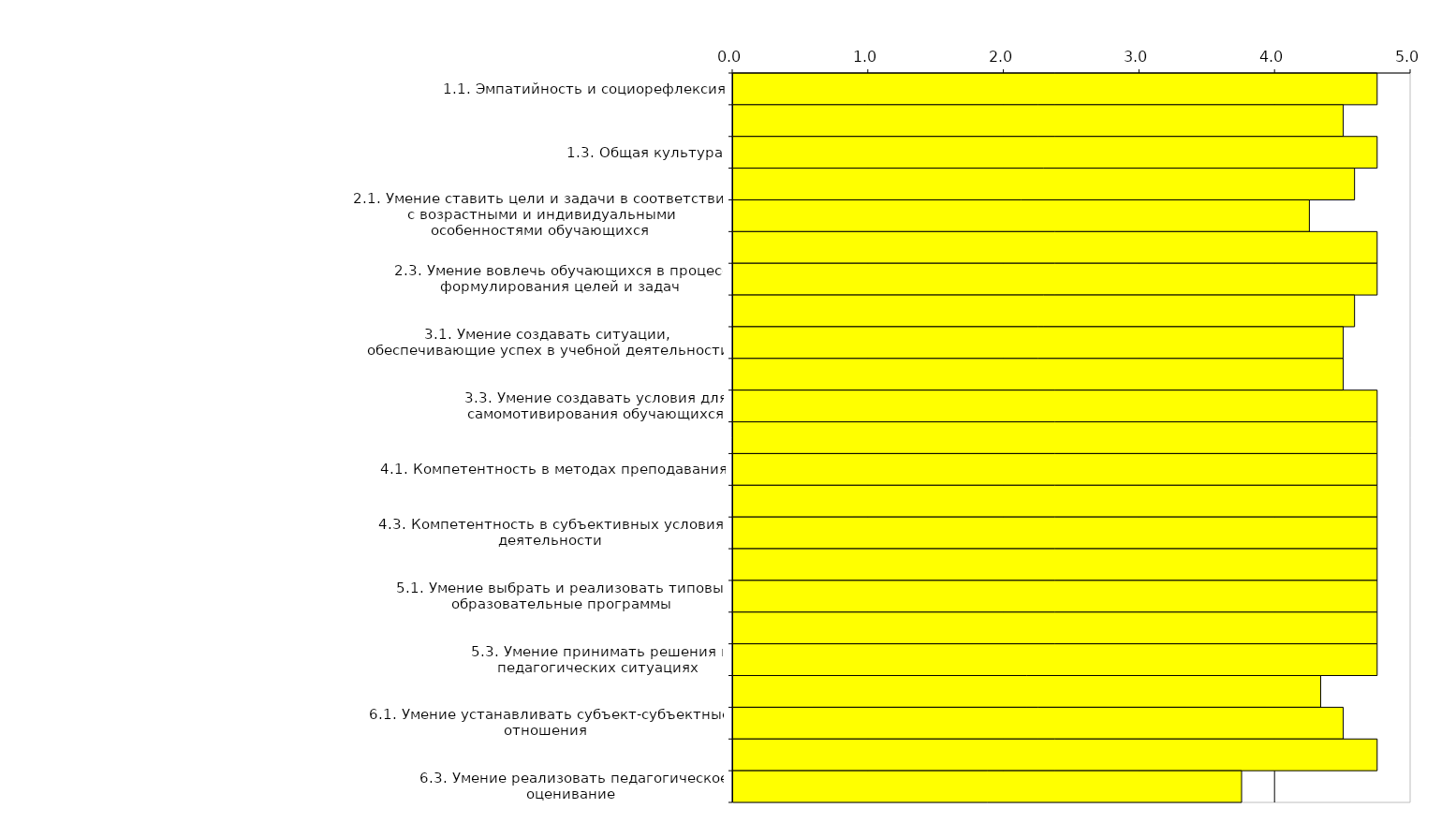
| Category | Series 0 |
|---|---|
| 1.1. Эмпатийность и социорефлексия | 4.75 |
| 1.2. Самоорганизованность | 4.5 |
| 1.3. Общая культура | 4.75 |
| 2. Компетентность в области постановки целей и задач педагогической деятельности | 4.583 |
| 2.1. Умение ставить цели и задачи в соответствии с возрастными и индивидуальными особенностями обучающихся | 4.25 |
| 2.2. Умение перевести тему урока в педагогическую задачу | 4.75 |
| 2.3. Умение вовлечь обучающихся в процесс формулирования целей и задач | 4.75 |
| 3. Компетентность в области мотивации учебной деятельности | 4.583 |
| 3.1. Умение создавать ситуации, обеспечивающие успех в учебной деятельности | 4.5 |
| 3.2. Умение создавать условия, обеспечения позитивной мотивации обучающихся | 4.5 |
| 3.3. Умение создавать условия для самомотивирования обучающихся | 4.75 |
| 4. Компетентность в области обеспечения информационной основы деятельности | 4.75 |
| 4.1. Компетентность в методах преподавания | 4.75 |
| 4.2. Компетентность в предмете преподавания | 4.75 |
| 4.3. Компетентность в субъективных условиях деятельности | 4.75 |
| 5. Компетентность в области разработки программы деятельности и принятии педагогических решений | 4.75 |
| 5.1. Умение выбрать и реализовать типовые образовательные программы | 4.75 |
| 5.2. Умение разработать собственную программу, методические и дидактические материалы | 4.75 |
| 5.3. Умение принимать решения в педагогических ситуациях | 4.75 |
| 6. Компетентность в области организации учебной деятельности | 4.333 |
| 6.1. Умение устанавливать субъект-субъектные отношения | 4.5 |
| 6.2. Умение организовать учебную деятельность обучающихся | 4.75 |
| 6.3. Умение реализовать педагогическое оценивание | 3.75 |